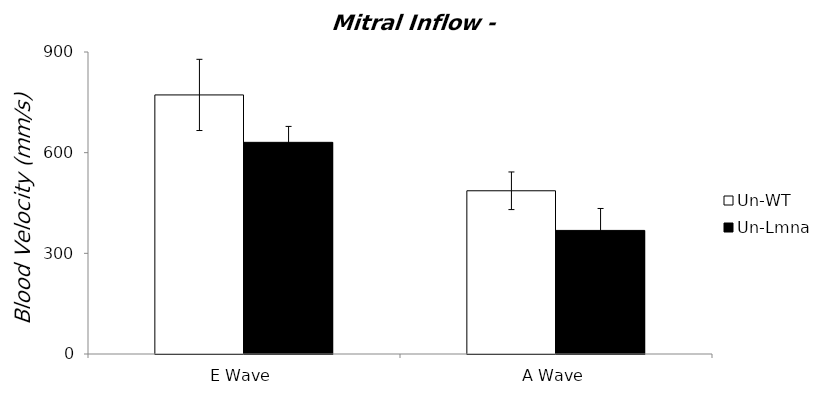
| Category | Un-WT | Un-Lmna |
|---|---|---|
| 0 | 772.076 | 630.774 |
| 1 | 486.427 | 368.294 |